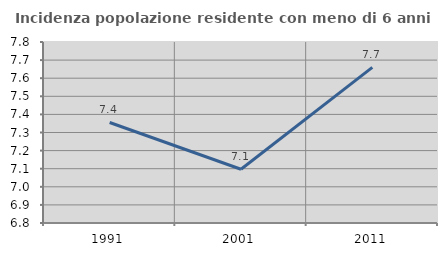
| Category | Incidenza popolazione residente con meno di 6 anni |
|---|---|
| 1991.0 | 7.355 |
| 2001.0 | 7.097 |
| 2011.0 | 7.66 |